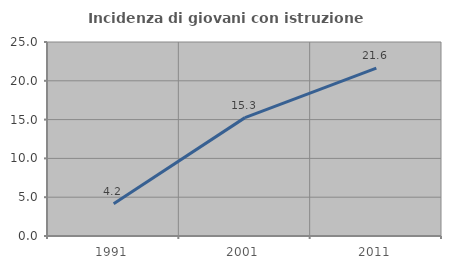
| Category | Incidenza di giovani con istruzione universitaria |
|---|---|
| 1991.0 | 4.167 |
| 2001.0 | 15.254 |
| 2011.0 | 21.622 |